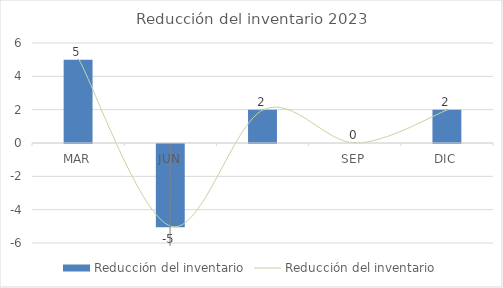
| Category | Reducción del inventario |
|---|---|
| MAR | 5 |
| JUN | -5 |
| SEP | 2 |
| DIC | 0 |
| TOTAL AÑO | 2 |